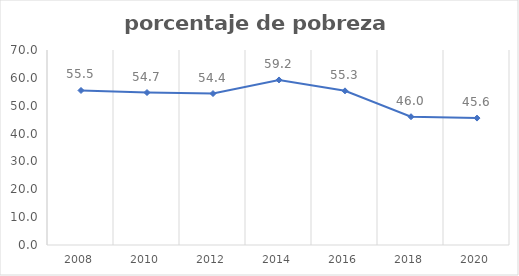
| Category | Series 0 |
|---|---|
| 2008.0 | 55.473 |
| 2010.0 | 54.728 |
| 2012.0 | 54.367 |
| 2014.0 | 59.247 |
| 2016.0 | 55.338 |
| 2018.0 | 46.045 |
| 2020.0 | 45.562 |